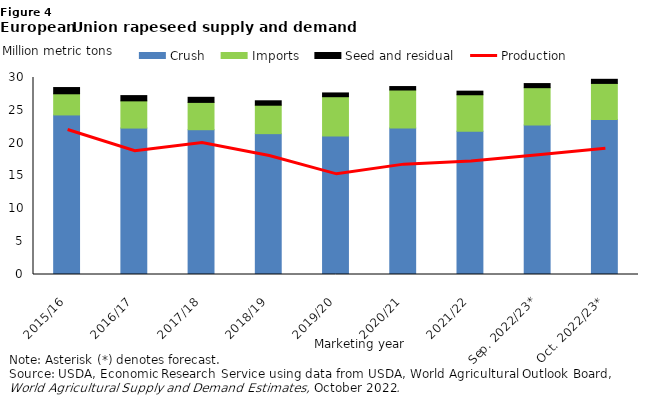
| Category | Crush | Imports | Seed and residual |
|---|---|---|---|
| 2015/16 | 24.3 | 3.22 | 0.95 |
| 2016/17 | 22.3 | 4.143 | 0.8 |
| 2017/18 | 22.05 | 4.158 | 0.775 |
| 2018/19 | 21.45 | 4.329 | 0.675 |
| 2019/20 | 21.1 | 5.975 | 0.575 |
| 2020/21 | 22.3 | 5.797 | 0.525 |
| 2021/22 | 21.8 | 5.571 | 0.55 |
| Sep. 2022/23* | 22.75 | 5.7 | 0.625 |
| Oct. 2022/23* | 23.6 | 5.5 | 0.625 |